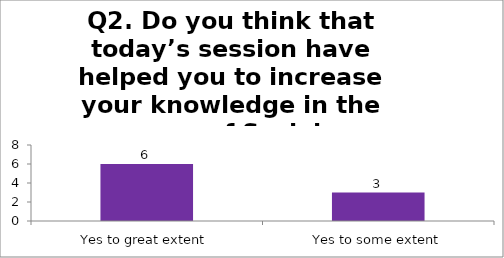
| Category | Q2. Do you think that today’s session have helped you to increase your knowledge in the area of Social Entrepreneurship? |
|---|---|
| Yes to great extent | 6 |
| Yes to some extent | 3 |